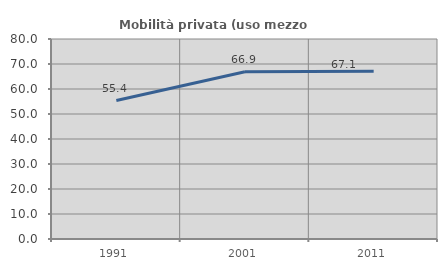
| Category | Mobilità privata (uso mezzo privato) |
|---|---|
| 1991.0 | 55.393 |
| 2001.0 | 66.899 |
| 2011.0 | 67.057 |